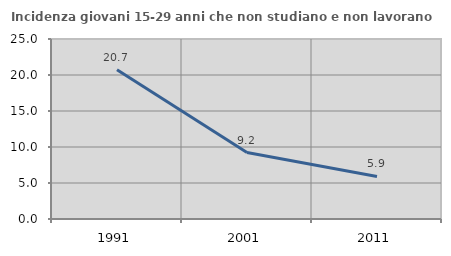
| Category | Incidenza giovani 15-29 anni che non studiano e non lavorano  |
|---|---|
| 1991.0 | 20.714 |
| 2001.0 | 9.231 |
| 2011.0 | 5.904 |